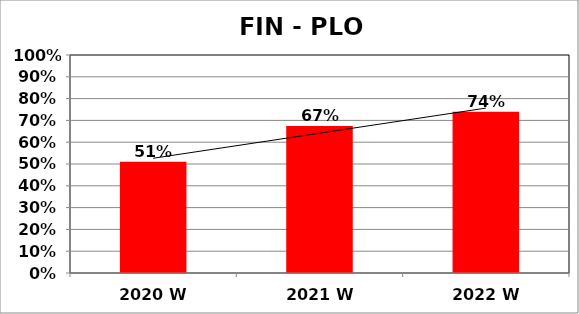
| Category | Series 0 |
|---|---|
| 2020 W | 0.51 |
| 2021 W | 0.674 |
| 2022 W | 0.74 |